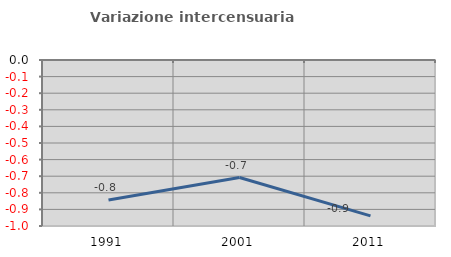
| Category | Variazione intercensuaria annua |
|---|---|
| 1991.0 | -0.844 |
| 2001.0 | -0.708 |
| 2011.0 | -0.939 |